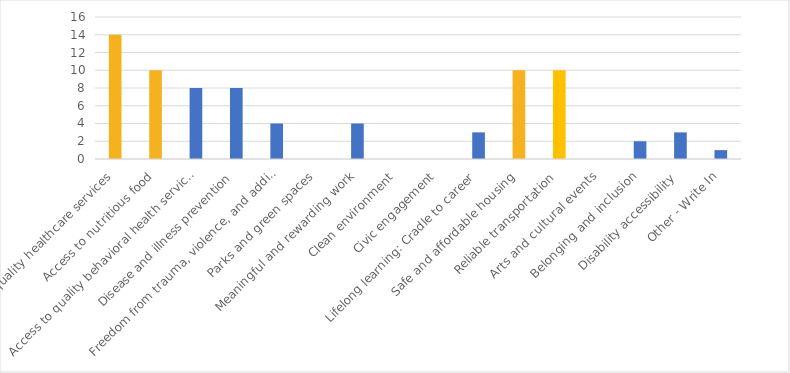
| Category | Number of Responses |
|---|---|
| Access to quality healthcare services | 14 |
| Access to nutritious food | 10 |
| Access to quality behavioral health services | 8 |
| Disease and illness prevention | 8 |
| Freedom from trauma, violence, and addiction | 4 |
| Parks and green spaces | 0 |
| Meaningful and rewarding work | 4 |
| Clean environment | 0 |
| Civic engagement | 0 |
| Lifelong learning: Cradle to career | 3 |
| Safe and affordable housing | 10 |
| Reliable transportation | 10 |
| Arts and cultural events | 0 |
| Belonging and inclusion | 2 |
| Disability accessibility | 3 |
| Other - Write In | 1 |